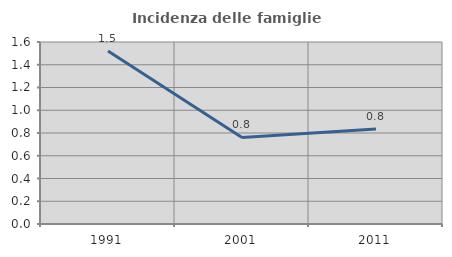
| Category | Incidenza delle famiglie numerose |
|---|---|
| 1991.0 | 1.521 |
| 2001.0 | 0.761 |
| 2011.0 | 0.835 |